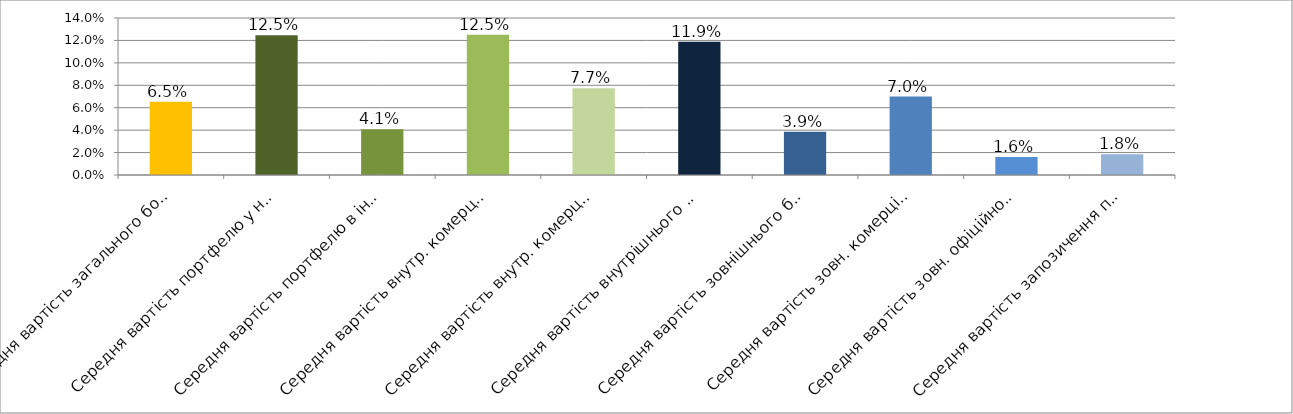
| Category | Series 0 |
|---|---|
| Середня вартість загального боргового портфелю | 0.065 |
| Середня вартість портфелю у нац.валюті | 0.125 |
| Середня вартість портфелю в іноземній валюті | 0.041 |
| Середня вартість внутр. комерційного портфелю в нац.валюті | 0.125 |
| Середня вартість внутр. комерційного портфелю в іноземній валюті | 0.077 |
| Середня вартість внутрішнього боргового портфелю | 0.119 |
| Середня вартість зовнішнього боргового портфелю | 0.039 |
| Середня вартість зовн. комерційного портфелю в іноземній валюті | 0.07 |
| Середня вартість зовн. офіційного портфелю в іноземній валюті | 0.016 |
| Середня вартість запозичення під держгарантії США в іноземній валюті | 0.018 |